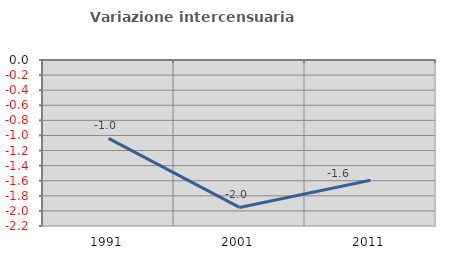
| Category | Variazione intercensuaria annua |
|---|---|
| 1991.0 | -1.038 |
| 2001.0 | -1.954 |
| 2011.0 | -1.595 |